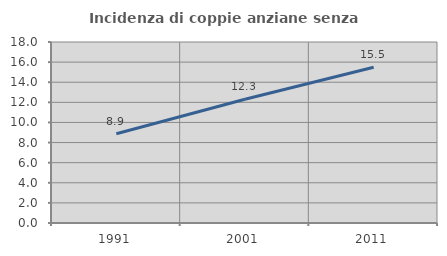
| Category | Incidenza di coppie anziane senza figli  |
|---|---|
| 1991.0 | 8.874 |
| 2001.0 | 12.301 |
| 2011.0 | 15.496 |